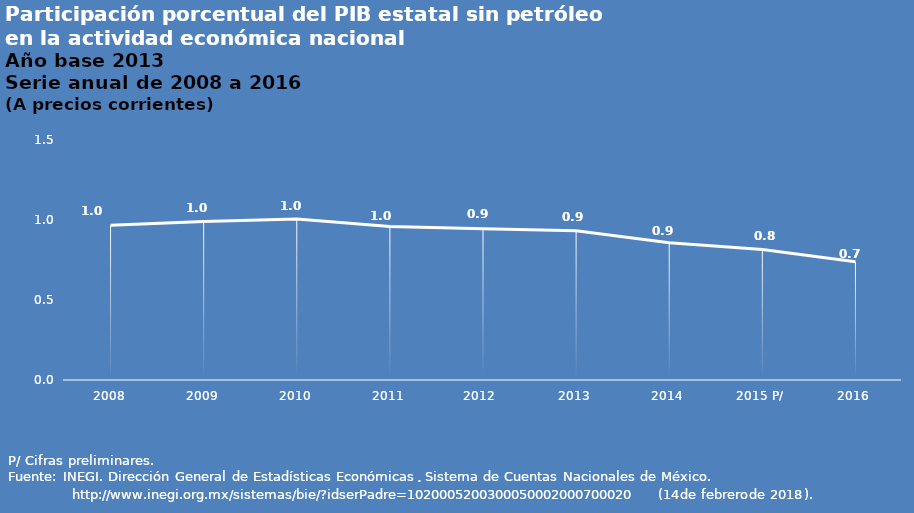
| Category | Series 0 |
|---|---|
| 2008 | 0.968 |
| 2009 | 0.991 |
| 2010 | 1.007 |
| 2011 | 0.96 |
| 2012  | 0.946 |
| 2013 | 0.933 |
| 2014 | 0.858 |
| 2015 P/ | 0.815 |
| 2016 | 0.739 |